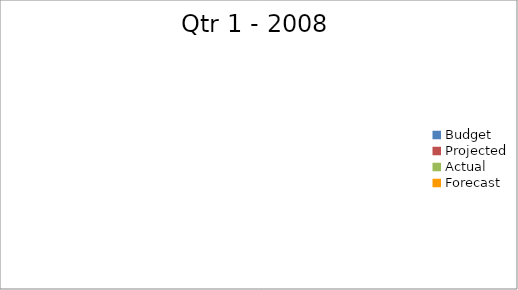
| Category | Series 0 |
|---|---|
| Budget | 1610 |
| Projected | 510 |
| Actual | 3060 |
| Forecast | 2750 |